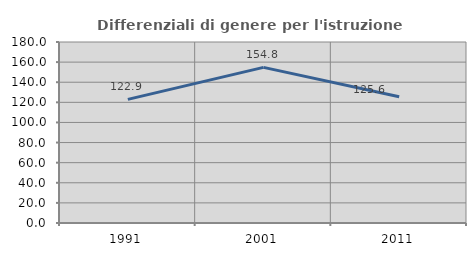
| Category | Differenziali di genere per l'istruzione superiore |
|---|---|
| 1991.0 | 122.903 |
| 2001.0 | 154.759 |
| 2011.0 | 125.554 |